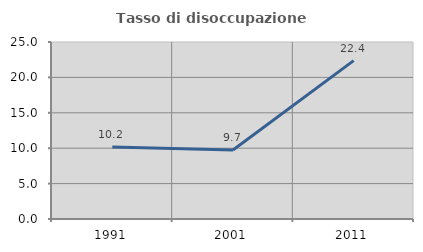
| Category | Tasso di disoccupazione giovanile  |
|---|---|
| 1991.0 | 10.187 |
| 2001.0 | 9.742 |
| 2011.0 | 22.373 |